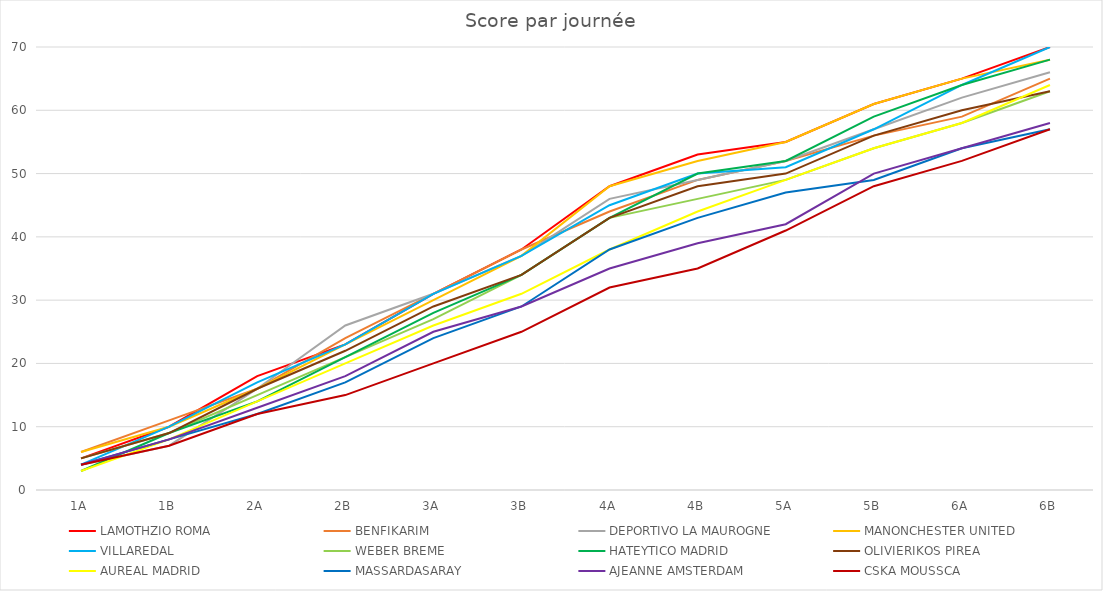
| Category | LAMOTHZIO ROMA | BENFIKARIM | DEPORTIVO LA MAUROGNE | MANONCHESTER UNITED | VILLAREDAL | WEBER BREME | HATEYTICO MADRID | OLIVIERIKOS PIREA | AUREAL MADRID  | MASSARDASARAY | AJEANNE AMSTERDAM | CSKA MOUSSCA |
|---|---|---|---|---|---|---|---|---|---|---|---|---|
| 1A | 5 | 6 | 4 | 6 | 4 | 5 | 3 | 5 | 3 | 4 | 4 | 4 |
| 1B | 10 | 11 | 7 | 10 | 10 | 9 | 9 | 9 | 8 | 8 | 8 | 7 |
| 2A | 18 | 16 | 16 | 16 | 17 | 15 | 14 | 16 | 14 | 12 | 13 | 12 |
| 2B | 23 | 24 | 26 | 23 | 23 | 21 | 21 | 22 | 20 | 17 | 18 | 15 |
| 3A | 31 | 31 | 31 | 30 | 31 | 27 | 28 | 29 | 26 | 24 | 25 | 20 |
| 3B | 38 | 38 | 37 | 37 | 37 | 34 | 34 | 34 | 31 | 29 | 29 | 25 |
| 4A | 48 | 44 | 46 | 48 | 45 | 43 | 43 | 43 | 38 | 38 | 35 | 32 |
| 4B | 53 | 49 | 49 | 52 | 50 | 46 | 50 | 48 | 44 | 43 | 39 | 35 |
| 5A | 55 | 52 | 52 | 55 | 51 | 49 | 52 | 50 | 49 | 47 | 42 | 41 |
| 5B | 61 | 56 | 57 | 61 | 57 | 54 | 59 | 56 | 54 | 49 | 50 | 48 |
| 6A | 65 | 59 | 62 | 65 | 64 | 58 | 64 | 60 | 58 | 54 | 54 | 52 |
| 6B | 70 | 65 | 66 | 68 | 70 | 63 | 68 | 63 | 64 | 57 | 58 | 57 |